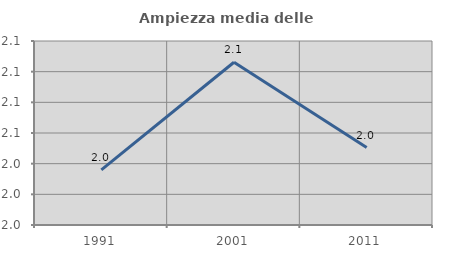
| Category | Ampiezza media delle famiglie |
|---|---|
| 1991.0 | 2.044 |
| 2001.0 | 2.062 |
| 2011.0 | 2.048 |